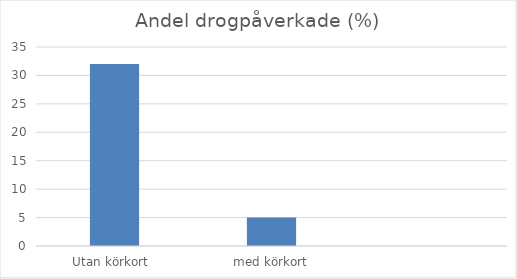
| Category | Andel % |
|---|---|
| Utan körkort  | 32 |
| med körkort | 5 |